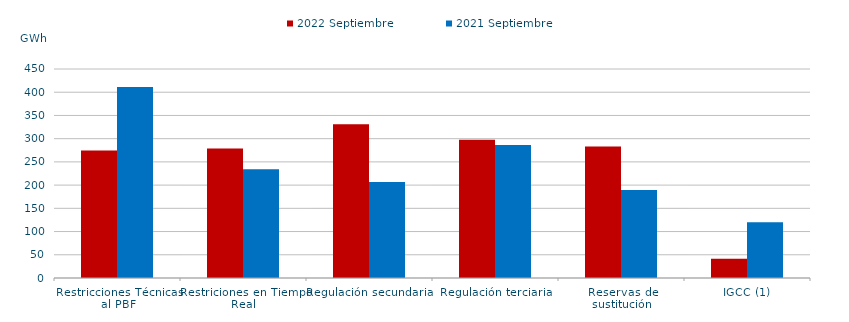
| Category | 2022 Septiembre | 2021 Septiembre |
|---|---|---|
| Restricciones Técnicas al PBF | 274.39 | 411.424 |
| Restriciones en Tiempo Real | 278.853 | 234.229 |
| Regulación secundaria | 330.978 | 206.746 |
| Regulación terciaria | 297.869 | 286.622 |
| Reservas de sustitución | 283.395 | 189.456 |
| IGCC (1) | 41.337 | 119.896 |